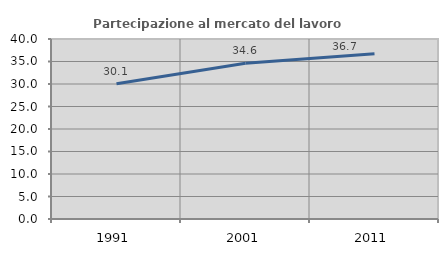
| Category | Partecipazione al mercato del lavoro  femminile |
|---|---|
| 1991.0 | 30.051 |
| 2001.0 | 34.612 |
| 2011.0 | 36.73 |